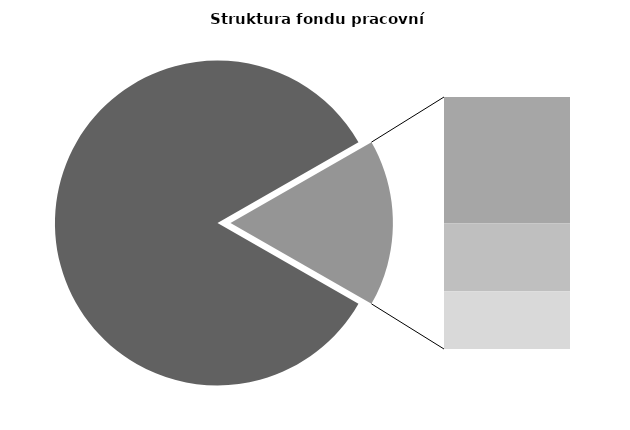
| Category | Series 0 |
|---|---|
| Průměrná měsíční odpracovaná doba bez přesčasu | 141.775 |
| Dovolená | 14.116 |
| Nemoc | 7.6 |
| Jiné | 6.453 |